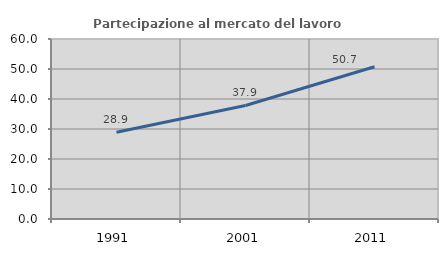
| Category | Partecipazione al mercato del lavoro  femminile |
|---|---|
| 1991.0 | 28.886 |
| 2001.0 | 37.85 |
| 2011.0 | 50.732 |